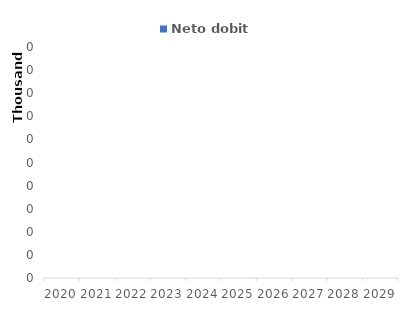
| Category | Neto dobit |
|---|---|
| 2020.0 | 0 |
| 2021.0 | 0 |
| 2022.0 | 0 |
| 2023.0 | 0 |
| 2024.0 | 0 |
| 2025.0 | 0 |
| 2026.0 | 0 |
| 2027.0 | 0 |
| 2028.0 | 0 |
| 2029.0 | 0 |